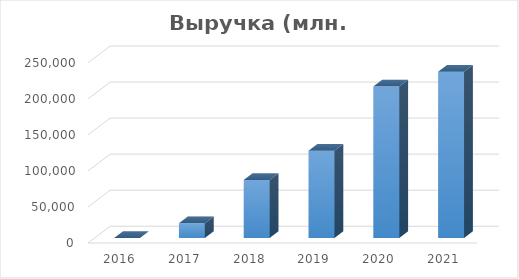
| Category | Выручка (млн. руб.) |
|---|---|
| 2016.0 | 0 |
| 2017.0 | 20456 |
| 2018.0 | 80364 |
| 2019.0 | 120998 |
| 2020.0 | 210223 |
| 2021.0 | 230457 |